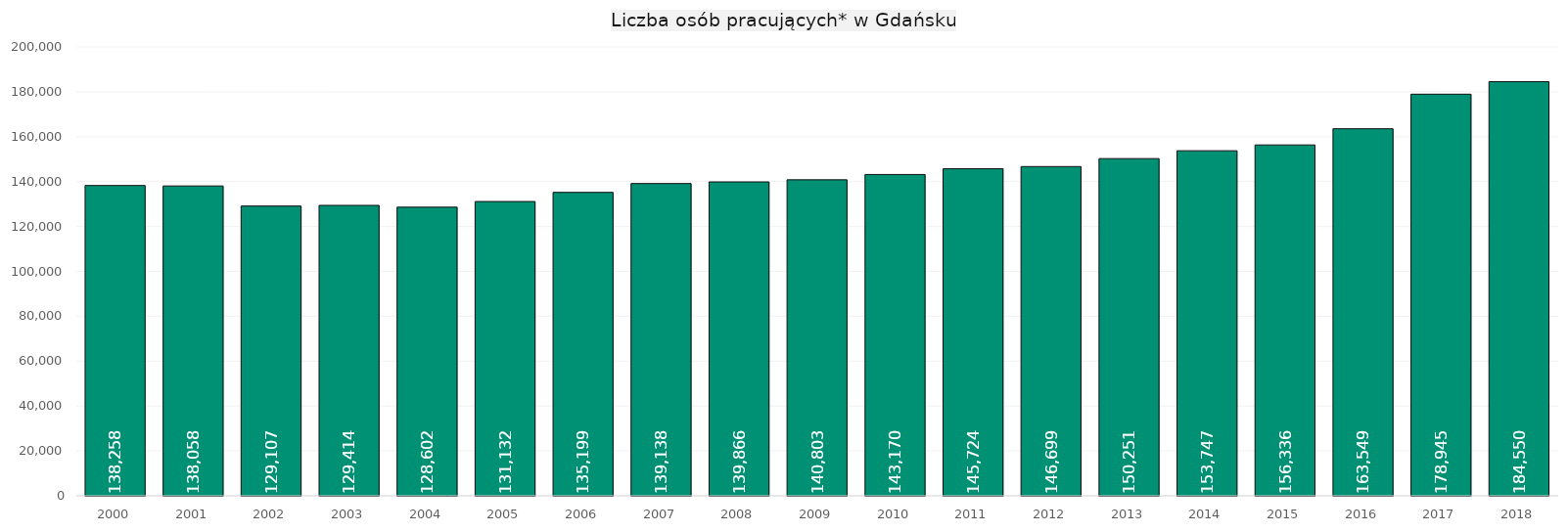
| Category | pracujący |
|---|---|
| 2000.0 | 138258 |
| 2001.0 | 138058 |
| 2002.0 | 129107 |
| 2003.0 | 129414 |
| 2004.0 | 128602 |
| 2005.0 | 131132 |
| 2006.0 | 135199 |
| 2007.0 | 139138 |
| 2008.0 | 139866 |
| 2009.0 | 140803 |
| 2010.0 | 143170 |
| 2011.0 | 145724 |
| 2012.0 | 146699 |
| 2013.0 | 150251 |
| 2014.0 | 153747 |
| 2015.0 | 156336 |
| 2016.0 | 163549 |
| 2017.0 | 178945 |
| 2018.0 | 184550 |